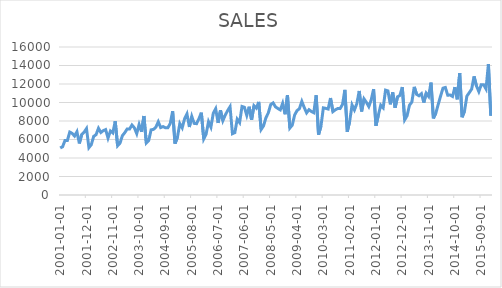
| Category | SALES |
|---|---|
| 2001-01-01 | 5082 |
| 2001-02-01 | 5216 |
| 2001-03-01 | 5893 |
| 2001-04-01 | 5894 |
| 2001-05-01 | 6799 |
| 2001-06-01 | 6667 |
| 2001-07-01 | 6374 |
| 2001-08-01 | 6840 |
| 2001-09-01 | 5575 |
| 2001-10-01 | 6545 |
| 2001-11-01 | 6789 |
| 2001-12-01 | 7180 |
| 2002-01-01 | 5117 |
| 2002-02-01 | 5442 |
| 2002-03-01 | 6337 |
| 2002-04-01 | 6525 |
| 2002-05-01 | 7216 |
| 2002-06-01 | 6761 |
| 2002-07-01 | 6958 |
| 2002-08-01 | 7070 |
| 2002-09-01 | 6148 |
| 2002-10-01 | 6924 |
| 2002-11-01 | 6716 |
| 2002-12-01 | 7975 |
| 2003-01-01 | 5326 |
| 2003-02-01 | 5609 |
| 2003-03-01 | 6414 |
| 2003-04-01 | 6741 |
| 2003-05-01 | 7144 |
| 2003-06-01 | 7133 |
| 2003-07-01 | 7568 |
| 2003-08-01 | 7266 |
| 2003-09-01 | 6634 |
| 2003-10-01 | 7626 |
| 2003-11-01 | 6843 |
| 2003-12-01 | 8540 |
| 2004-01-01 | 5629 |
| 2004-02-01 | 5898 |
| 2004-03-01 | 7045 |
| 2004-04-01 | 7094 |
| 2004-05-01 | 7333 |
| 2004-06-01 | 7918 |
| 2004-07-01 | 7289 |
| 2004-08-01 | 7396 |
| 2004-09-01 | 7259 |
| 2004-10-01 | 7268 |
| 2004-11-01 | 7731 |
| 2004-12-01 | 9058 |
| 2005-01-01 | 5557 |
| 2005-02-01 | 6237 |
| 2005-03-01 | 7723 |
| 2005-04-01 | 7262 |
| 2005-05-01 | 8241 |
| 2005-06-01 | 8757 |
| 2005-07-01 | 7352 |
| 2005-08-01 | 8496 |
| 2005-09-01 | 7741 |
| 2005-10-01 | 7710 |
| 2005-11-01 | 8247 |
| 2005-12-01 | 8902 |
| 2006-01-01 | 6066 |
| 2006-02-01 | 6590 |
| 2006-03-01 | 7923 |
| 2006-04-01 | 7335 |
| 2006-05-01 | 8843 |
| 2006-06-01 | 9327 |
| 2006-07-01 | 7792 |
| 2006-08-01 | 9156 |
| 2006-09-01 | 8037 |
| 2006-10-01 | 8640 |
| 2006-11-01 | 9128 |
| 2006-12-01 | 9545 |
| 2007-01-01 | 6627 |
| 2007-02-01 | 6743 |
| 2007-03-01 | 8195 |
| 2007-04-01 | 7828 |
| 2007-05-01 | 9570 |
| 2007-06-01 | 9484 |
| 2007-07-01 | 8608 |
| 2007-08-01 | 9543 |
| 2007-09-01 | 8123 |
| 2007-10-01 | 9649 |
| 2007-11-01 | 9390 |
| 2007-12-01 | 10065 |
| 2008-01-01 | 7088 |
| 2008-02-01 | 7476 |
| 2008-03-01 | 8355 |
| 2008-04-01 | 8882 |
| 2008-05-01 | 9778 |
| 2008-06-01 | 9956 |
| 2008-07-01 | 9531 |
| 2008-08-01 | 9351 |
| 2008-09-01 | 9200 |
| 2008-10-01 | 9919 |
| 2008-11-01 | 8729 |
| 2008-12-01 | 10802 |
| 2009-01-01 | 7240 |
| 2009-02-01 | 7549 |
| 2009-03-01 | 8652 |
| 2009-04-01 | 9124 |
| 2009-05-01 | 9328 |
| 2009-06-01 | 10121 |
| 2009-07-01 | 9462 |
| 2009-08-01 | 8880 |
| 2009-09-01 | 9226 |
| 2009-10-01 | 9029 |
| 2009-11-01 | 8901 |
| 2009-12-01 | 10784 |
| 2010-01-01 | 6519 |
| 2010-02-01 | 7437 |
| 2010-03-01 | 9418 |
| 2010-04-01 | 9366 |
| 2010-05-01 | 9291 |
| 2010-06-01 | 10481 |
| 2010-07-01 | 9014 |
| 2010-08-01 | 9207 |
| 2010-09-01 | 9351 |
| 2010-10-01 | 9341 |
| 2010-11-01 | 9788 |
| 2010-12-01 | 11361 |
| 2011-01-01 | 6839 |
| 2011-02-01 | 7942 |
| 2011-03-01 | 9742 |
| 2011-04-01 | 9197 |
| 2011-05-01 | 9878 |
| 2011-06-01 | 11246 |
| 2011-07-01 | 9034 |
| 2011-08-01 | 10392 |
| 2011-09-01 | 10018 |
| 2011-10-01 | 9558 |
| 2011-11-01 | 10280 |
| 2011-12-01 | 11440 |
| 2012-01-01 | 7482 |
| 2012-02-01 | 8641 |
| 2012-03-01 | 9711 |
| 2012-04-01 | 9424 |
| 2012-05-01 | 11338 |
| 2012-06-01 | 11255 |
| 2012-07-01 | 9803 |
| 2012-08-01 | 11093 |
| 2012-09-01 | 9433 |
| 2012-10-01 | 10611 |
| 2012-11-01 | 10763 |
| 2012-12-01 | 11670 |
| 2013-01-01 | 8126 |
| 2013-02-01 | 8566 |
| 2013-03-01 | 9703 |
| 2013-04-01 | 10051 |
| 2013-05-01 | 11688 |
| 2013-06-01 | 10880 |
| 2013-07-01 | 10724 |
| 2013-08-01 | 10954 |
| 2013-09-01 | 9992 |
| 2013-10-01 | 11004 |
| 2013-11-01 | 10659 |
| 2013-12-01 | 12152 |
| 2014-01-01 | 8292 |
| 2014-02-01 | 8834 |
| 2014-03-01 | 9775 |
| 2014-04-01 | 10688 |
| 2014-05-01 | 11547 |
| 2014-06-01 | 11625 |
| 2014-07-01 | 10784 |
| 2014-08-01 | 10809 |
| 2014-09-01 | 10656 |
| 2014-10-01 | 11665 |
| 2014-11-01 | 10347 |
| 2014-12-01 | 13171 |
| 2015-01-01 | 8410 |
| 2015-02-01 | 9061 |
| 2015-03-01 | 10691 |
| 2015-04-01 | 11059 |
| 2015-05-01 | 11451 |
| 2015-06-01 | 12824 |
| 2015-07-01 | 11791 |
| 2015-08-01 | 11180 |
| 2015-09-01 | 11927 |
| 2015-10-01 | 11924 |
| 2015-11-01 | 11467 |
| 2015-12-01 | 14161 |
| 2016-01-01 | 8566 |